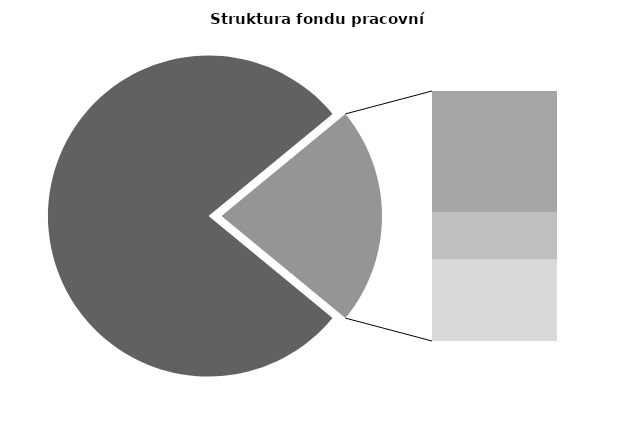
| Category | Series 0 |
|---|---|
| Průměrná měsíční odpracovaná doba bez přesčasu | 134.946 |
| Dovolená | 18.445 |
| Nemoc | 7.145 |
| Jiné | 12.321 |